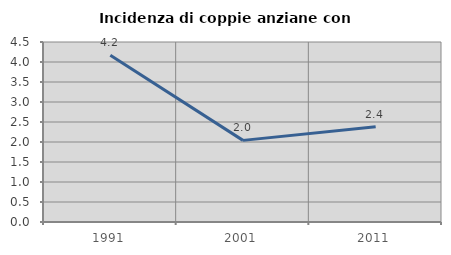
| Category | Incidenza di coppie anziane con figli |
|---|---|
| 1991.0 | 4.167 |
| 2001.0 | 2.041 |
| 2011.0 | 2.381 |